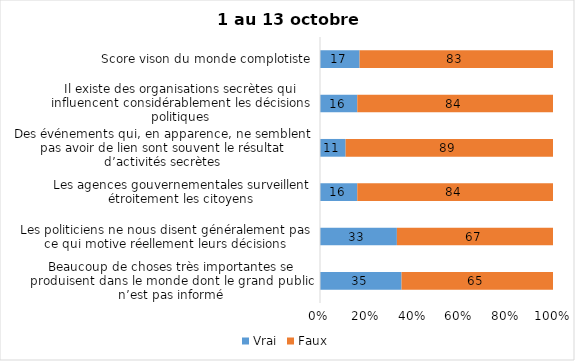
| Category | Vrai | Faux |
|---|---|---|
| Beaucoup de choses très importantes se produisent dans le monde dont le grand public n’est pas informé | 35 | 65 |
| Les politiciens ne nous disent généralement pas ce qui motive réellement leurs décisions | 33 | 67 |
| Les agences gouvernementales surveillent étroitement les citoyens | 16 | 84 |
| Des événements qui, en apparence, ne semblent pas avoir de lien sont souvent le résultat d’activités secrètes | 11 | 89 |
| Il existe des organisations secrètes qui influencent considérablement les décisions politiques | 16 | 84 |
| Score vison du monde complotiste | 17 | 83 |